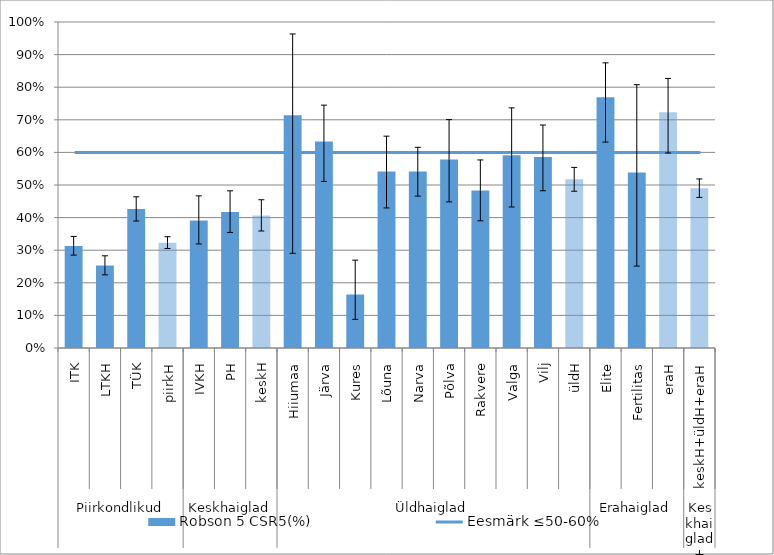
| Category | Robson 5 CSR5(%) |
|---|---|
| 0 | 0.313 |
| 1 | 0.253 |
| 2 | 0.426 |
| 3 | 0.323 |
| 4 | 0.391 |
| 5 | 0.417 |
| 6 | 0.406 |
| 7 | 0.714 |
| 8 | 0.634 |
| 9 | 0.164 |
| 10 | 0.541 |
| 11 | 0.541 |
| 12 | 0.578 |
| 13 | 0.483 |
| 14 | 0.591 |
| 15 | 0.586 |
| 16 | 0.518 |
| 17 | 0.769 |
| 18 | 0.538 |
| 19 | 0.723 |
| 20 | 0.49 |